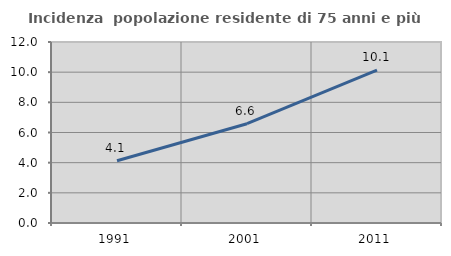
| Category | Incidenza  popolazione residente di 75 anni e più |
|---|---|
| 1991.0 | 4.129 |
| 2001.0 | 6.582 |
| 2011.0 | 10.129 |